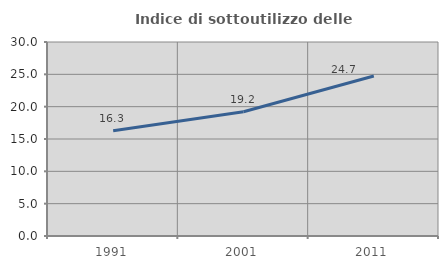
| Category | Indice di sottoutilizzo delle abitazioni  |
|---|---|
| 1991.0 | 16.273 |
| 2001.0 | 19.22 |
| 2011.0 | 24.74 |